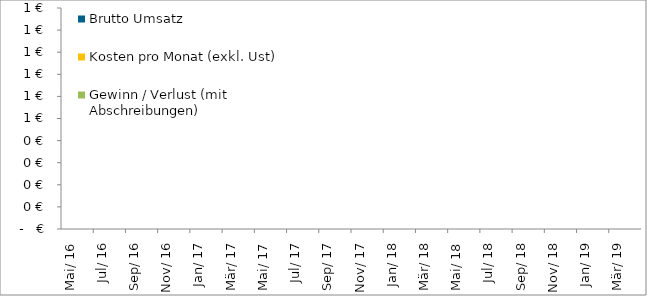
| Category | Brutto Umsatz | Kosten pro Monat (exkl. Ust) | Gewinn / Verlust (mit Abschreibungen) |
|---|---|---|---|
| 2016-05-01 | 0 | 0 | 0 |
| 2016-06-01 | 0 | 0 | 0 |
| 2016-07-01 | 0 | 0 | 0 |
| 2016-08-01 | 0 | 0 | 0 |
| 2016-09-01 | 0 | 0 | 0 |
| 2016-10-01 | 0 | 0 | 0 |
| 2016-11-01 | 0 | 0 | 0 |
| 2016-12-01 | 0 | 0 | 0 |
| 2017-01-01 | 0 | 0 | 0 |
| 2017-02-01 | 0 | 0 | 0 |
| 2017-03-01 | 0 | 0 | 0 |
| 2017-04-01 | 0 | 0 | 0 |
| 2017-05-01 | 0 | 0 | 0 |
| 2017-06-01 | 0 | 0 | 0 |
| 2017-07-01 | 0 | 0 | 0 |
| 2017-08-01 | 0 | 0 | 0 |
| 2017-09-01 | 0 | 0 | 0 |
| 2017-10-01 | 0 | 0 | 0 |
| 2017-11-01 | 0 | 0 | 0 |
| 2017-12-01 | 0 | 0 | 0 |
| 2018-01-01 | 0 | 0 | 0 |
| 2018-02-01 | 0 | 0 | 0 |
| 2018-03-01 | 0 | 0 | 0 |
| 2018-04-01 | 0 | 0 | 0 |
| 2018-05-01 | 0 | 0 | 0 |
| 2018-06-01 | 0 | 0 | 0 |
| 2018-07-01 | 0 | 0 | 0 |
| 2018-08-01 | 0 | 0 | 0 |
| 2018-09-01 | 0 | 0 | 0 |
| 2018-10-01 | 0 | 0 | 0 |
| 2018-11-01 | 0 | 0 | 0 |
| 2018-12-01 | 0 | 0 | 0 |
| 2019-01-01 | 0 | 0 | 0 |
| 2019-02-01 | 0 | 0 | 0 |
| 2019-03-01 | 0 | 0 | 0 |
| 2019-04-01 | 0 | 0 | 0 |